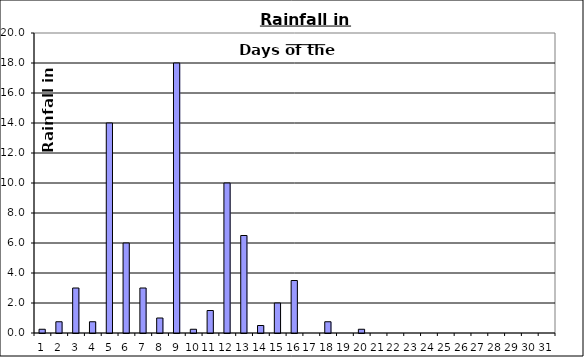
| Category | Series 0 |
|---|---|
| 0 | 0.25 |
| 1 | 0.75 |
| 2 | 3 |
| 3 | 0.75 |
| 4 | 14 |
| 5 | 6 |
| 6 | 3 |
| 7 | 1 |
| 8 | 18 |
| 9 | 0.25 |
| 10 | 1.5 |
| 11 | 10 |
| 12 | 6.5 |
| 13 | 0.5 |
| 14 | 2 |
| 15 | 3.5 |
| 16 | 0 |
| 17 | 0.75 |
| 18 | 0 |
| 19 | 0.25 |
| 20 | 0 |
| 21 | 0 |
| 22 | 0 |
| 23 | 0 |
| 24 | 0 |
| 25 | 0 |
| 26 | 0 |
| 27 | 0 |
| 28 | 0 |
| 29 | 0 |
| 30 | 0 |